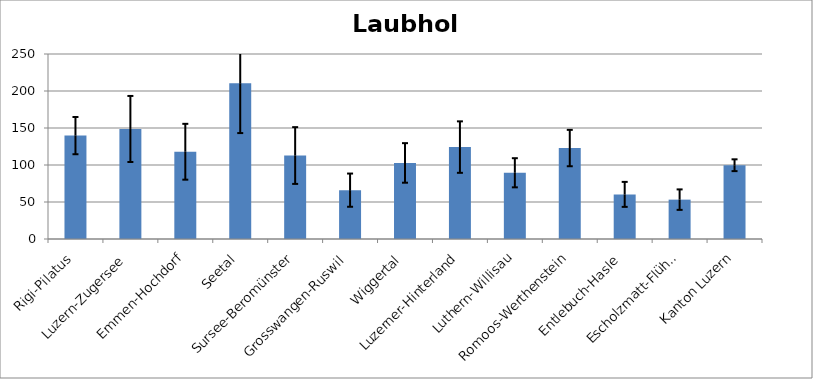
| Category | Laubholz |
|---|---|
| Rigi-Pilatus | 139.7 |
| Luzern-Zugersee | 148.7 |
| Emmen-Hochdorf | 117.9 |
| Seetal | 210.5 |
| Sursee-Beromünster | 112.8 |
| Grosswangen-Ruswil | 66 |
| Wiggertal | 102.8 |
| Luzerner-Hinterland | 124.2 |
| Luthern-Willisau | 89.5 |
| Romoos-Werthenstein | 122.9 |
| Entlebuch-Hasle | 60.3 |
| Escholzmatt-Flühli | 53.2 |
| Kanton Luzern | 99.7 |